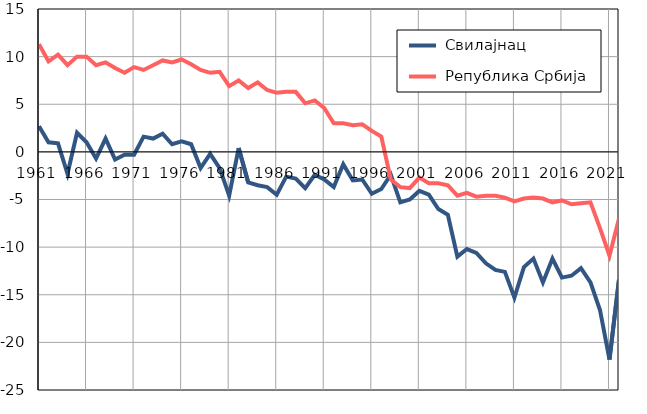
| Category |  Свилајнац |  Република Србија |
|---|---|---|
| 1961.0 | 2.7 | 11.3 |
| 1962.0 | 1 | 9.5 |
| 1963.0 | 0.9 | 10.2 |
| 1964.0 | -2.3 | 9.1 |
| 1965.0 | 2 | 10 |
| 1966.0 | 1 | 10 |
| 1967.0 | -0.7 | 9.1 |
| 1968.0 | 1.4 | 9.4 |
| 1969.0 | -0.8 | 8.8 |
| 1970.0 | -0.3 | 8.3 |
| 1971.0 | -0.3 | 8.9 |
| 1972.0 | 1.6 | 8.6 |
| 1973.0 | 1.4 | 9.1 |
| 1974.0 | 1.9 | 9.6 |
| 1975.0 | 0.8 | 9.4 |
| 1976.0 | 1.1 | 9.7 |
| 1977.0 | 0.8 | 9.2 |
| 1978.0 | -1.7 | 8.6 |
| 1979.0 | -0.2 | 8.3 |
| 1980.0 | -1.7 | 8.4 |
| 1981.0 | -4.6 | 6.9 |
| 1982.0 | 0.4 | 7.5 |
| 1983.0 | -3.2 | 6.7 |
| 1984.0 | -3.5 | 7.3 |
| 1985.0 | -3.7 | 6.5 |
| 1986.0 | -4.5 | 6.2 |
| 1987.0 | -2.6 | 6.3 |
| 1988.0 | -2.8 | 6.3 |
| 1989.0 | -3.8 | 5.1 |
| 1990.0 | -2.4 | 5.4 |
| 1991.0 | -2.9 | 4.6 |
| 1992.0 | -3.7 | 3 |
| 1993.0 | -1.3 | 3 |
| 1994.0 | -3 | 2.8 |
| 1995.0 | -2.9 | 2.9 |
| 1996.0 | -4.4 | 2.2 |
| 1997.0 | -3.9 | 1.6 |
| 1998.0 | -2.4 | -2.9 |
| 1999.0 | -5.3 | -3.7 |
| 2000.0 | -5 | -3.8 |
| 2001.0 | -4.1 | -2.7 |
| 2002.0 | -4.5 | -3.3 |
| 2003.0 | -6 | -3.3 |
| 2004.0 | -6.6 | -3.5 |
| 2005.0 | -11 | -4.6 |
| 2006.0 | -10.2 | -4.3 |
| 2007.0 | -10.6 | -4.7 |
| 2008.0 | -11.7 | -4.6 |
| 2009.0 | -12.4 | -4.6 |
| 2010.0 | -12.6 | -4.8 |
| 2011.0 | -15.3 | -5.2 |
| 2012.0 | -12.1 | -4.9 |
| 2013.0 | -11.2 | -4.8 |
| 2014.0 | -13.7 | -4.9 |
| 2015.0 | -11.2 | -5.3 |
| 2016.0 | -13.2 | -5.1 |
| 2017.0 | -13 | -5.5 |
| 2018.0 | -12.2 | -5.4 |
| 2019.0 | -13.7 | -5.3 |
| 2020.0 | -16.6 | -8 |
| 2021.0 | -21.8 | -10.9 |
| 2022.0 | -13.4 | -7 |